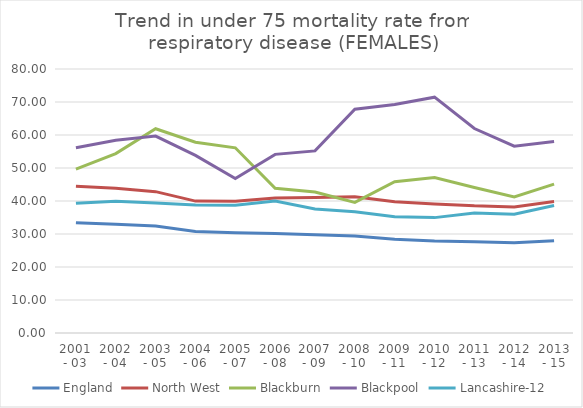
| Category | England | North West | Blackburn | Blackpool | Lancashire-12 |
|---|---|---|---|---|---|
| 2001 - 03 | 33.43 | 44.478 | 49.648 | 56.128 | 39.327 |
| 2002 - 04 | 32.953 | 43.839 | 54.359 | 58.439 | 39.958 |
| 2003 - 05 | 32.453 | 42.833 | 61.896 | 59.676 | 39.357 |
| 2004 - 06 | 30.758 | 39.965 | 57.808 | 53.808 | 38.82 |
| 2005 - 07 | 30.359 | 39.913 | 56.116 | 46.84 | 38.726 |
| 2006 - 08 | 30.126 | 40.917 | 43.852 | 54.139 | 40.005 |
| 2007 - 09 | 29.784 | 41.034 | 42.715 | 55.187 | 37.565 |
| 2008 - 10 | 29.401 | 41.303 | 39.589 | 67.807 | 36.754 |
| 2009 - 11 | 28.442 | 39.749 | 45.832 | 69.252 | 35.264 |
| 2010 - 12 | 27.909 | 39.128 | 47.101 | 71.459 | 34.965 |
| 2011 - 13 | 27.644 | 38.526 | 44.086 | 61.959 | 36.376 |
| 2012 - 14 | 27.37 | 38.201 | 41.26 | 56.628 | 35.975 |
| 2013 - 15 | 27.978 | 39.835 | 45.102 | 58.036 | 38.622 |